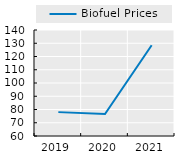
| Category | Biofuel Prices |
|---|---|
| 2019.0 | 78.019 |
| 2020.0 | 76.614 |
| 2021.0 | 128.515 |